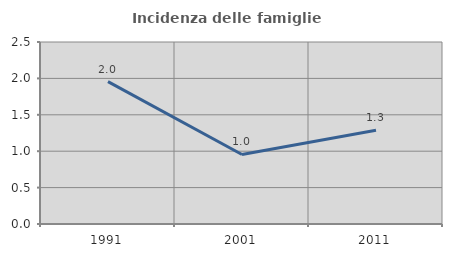
| Category | Incidenza delle famiglie numerose |
|---|---|
| 1991.0 | 1.956 |
| 2001.0 | 0.955 |
| 2011.0 | 1.288 |